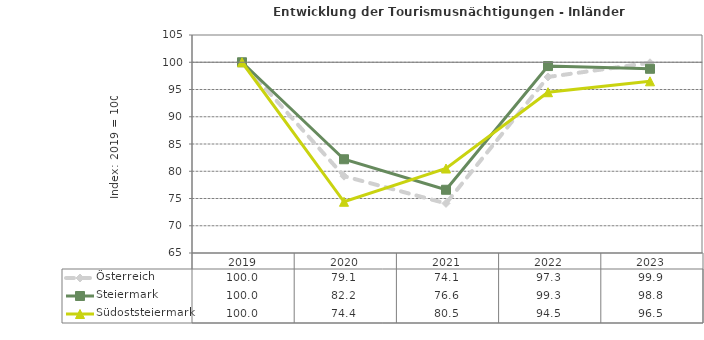
| Category | Österreich | Steiermark | Südoststeiermark |
|---|---|---|---|
| 2023.0 | 99.9 | 98.8 | 96.5 |
| 2022.0 | 97.3 | 99.3 | 94.5 |
| 2021.0 | 74.1 | 76.6 | 80.5 |
| 2020.0 | 79.1 | 82.2 | 74.4 |
| 2019.0 | 100 | 100 | 100 |